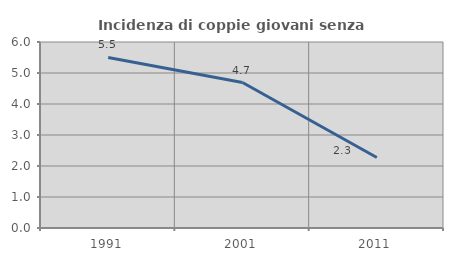
| Category | Incidenza di coppie giovani senza figli |
|---|---|
| 1991.0 | 5.502 |
| 2001.0 | 4.692 |
| 2011.0 | 2.276 |